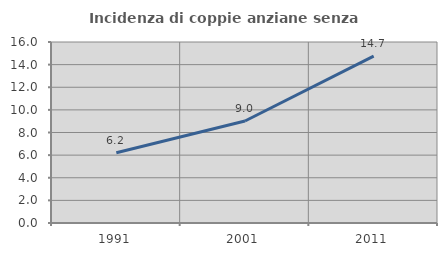
| Category | Incidenza di coppie anziane senza figli  |
|---|---|
| 1991.0 | 6.209 |
| 2001.0 | 9.016 |
| 2011.0 | 14.745 |